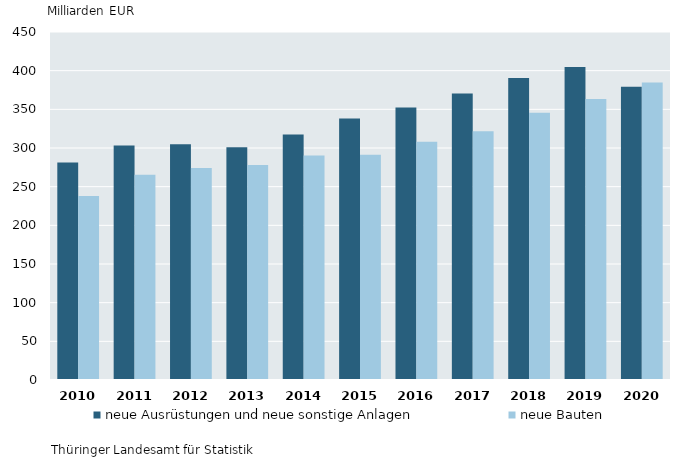
| Category | neue Ausrüstungen und neue sonstige Anlagen | neue Bauten |
|---|---|---|
| 2010.0 | 281.102 | 237.854 |
| 2011.0 | 303.312 | 265.259 |
| 2012.0 | 304.876 | 274.178 |
| 2013.0 | 300.875 | 278.15 |
| 2014.0 | 317.58 | 290.199 |
| 2015.0 | 338.294 | 291.243 |
| 2016.0 | 352.299 | 307.923 |
| 2017.0 | 370.527 | 321.721 |
| 2018.0 | 390.359 | 345.489 |
| 2019.0 | 404.757 | 363.473 |
| 2020.0 | 379.05 | 384.789 |